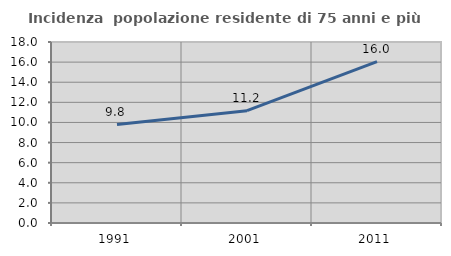
| Category | Incidenza  popolazione residente di 75 anni e più |
|---|---|
| 1991.0 | 9.791 |
| 2001.0 | 11.173 |
| 2011.0 | 16.042 |